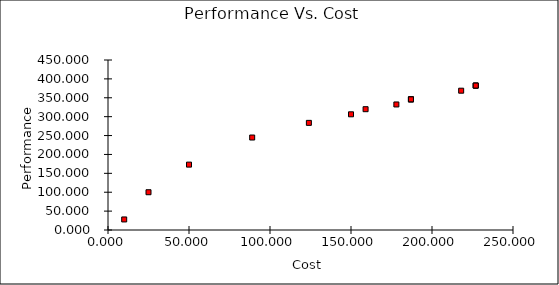
| Category | Series 0 |
|---|---|
| 10.00000000006053 | 27.926 |
| 24.99999999997556 | 100 |
| 50.0 | 173.054 |
| 89.0 | 244.792 |
| 124.0 | 283.594 |
| 150.0 | 306.25 |
| 159.0 | 319.792 |
| 178.0 | 332.292 |
| 187.0 | 345.833 |
| 187.0 | 345.833 |
| 187.0 | 345.833 |
| 218.0 | 368.75 |
| 227.0 | 382.292 |
| 227.0 | 382.292 |
| 227.0 | 382.292 |